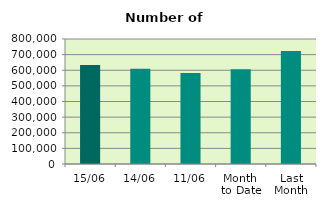
| Category | Series 0 |
|---|---|
| 15/06 | 633088 |
| 14/06 | 610322 |
| 11/06 | 582932 |
| Month 
to Date | 607039.818 |
| Last
Month | 723791.905 |